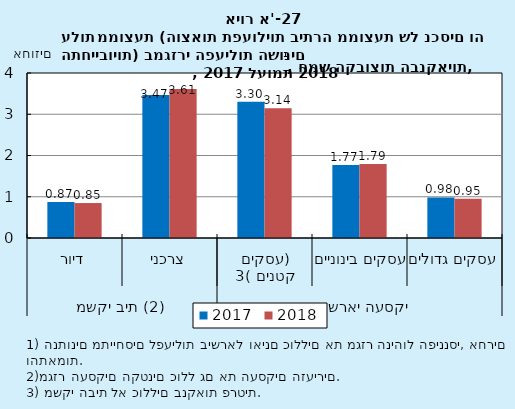
| Category | 2017 | 2018 |
|---|---|---|
| 0 | 0.874 | 0.847 |
| 1 | 3.468 | 3.612 |
| 2 | 3.302 | 3.145 |
| 3 | 1.772 | 1.794 |
| 4 | 0.983 | 0.95 |